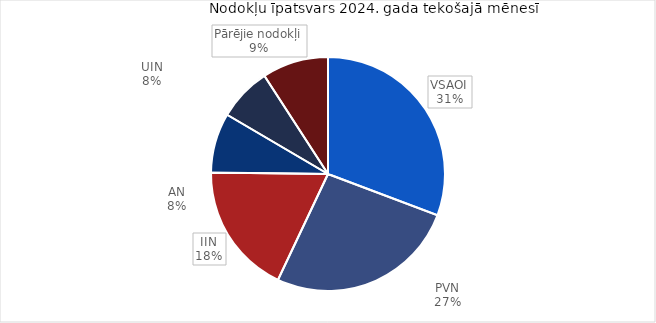
| Category | īpatsvars 2024 |
|---|---|
| VSAOI | 0.307 |
| PVN | 0.263 |
| IIN | 0.182 |
| AN | 0.083 |
| UIN | 0.074 |
| Pārējie nodokļi | 0.091 |